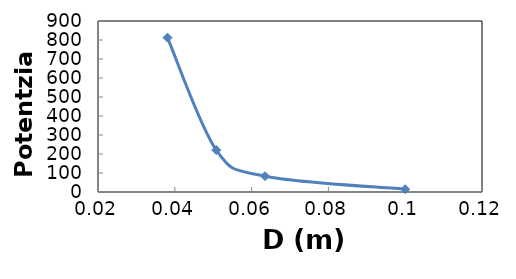
| Category | P (kW) |
|---|---|
| 0.038099999999999995 | 812.3 |
| 0.0508 | 220.8 |
| 0.0635 | 83.2 |
| 0.1 | 14.5 |